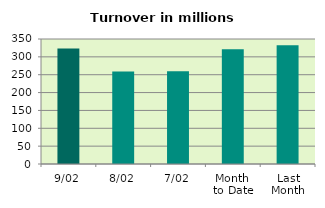
| Category | Series 0 |
|---|---|
| 9/02 | 323.497 |
| 8/02 | 258.967 |
| 7/02 | 259.835 |
| Month 
to Date | 321.58 |
| Last
Month | 332.646 |